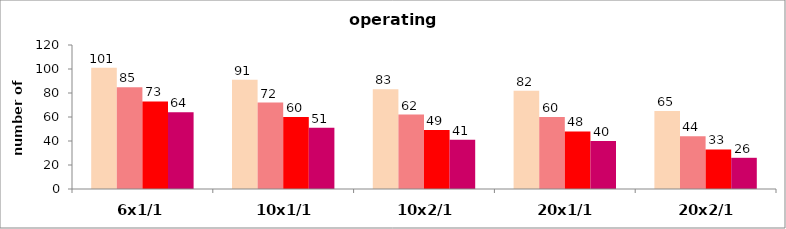
| Category | #REF! |
|---|---|
| 6x1/1 | 64.02 |
| 10x1/1 | 51.02 |
| 10x2/1 | 40.984 |
| 20x1/1 | 40 |
| 20x2/1 | 26.001 |